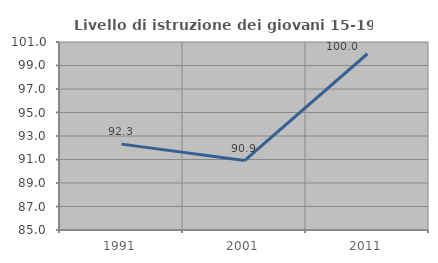
| Category | Livello di istruzione dei giovani 15-19 anni |
|---|---|
| 1991.0 | 92.308 |
| 2001.0 | 90.909 |
| 2011.0 | 100 |